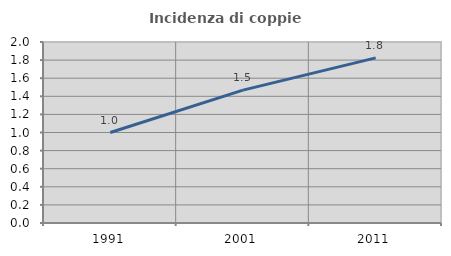
| Category | Incidenza di coppie miste |
|---|---|
| 1991.0 | 1 |
| 2001.0 | 1.468 |
| 2011.0 | 1.824 |